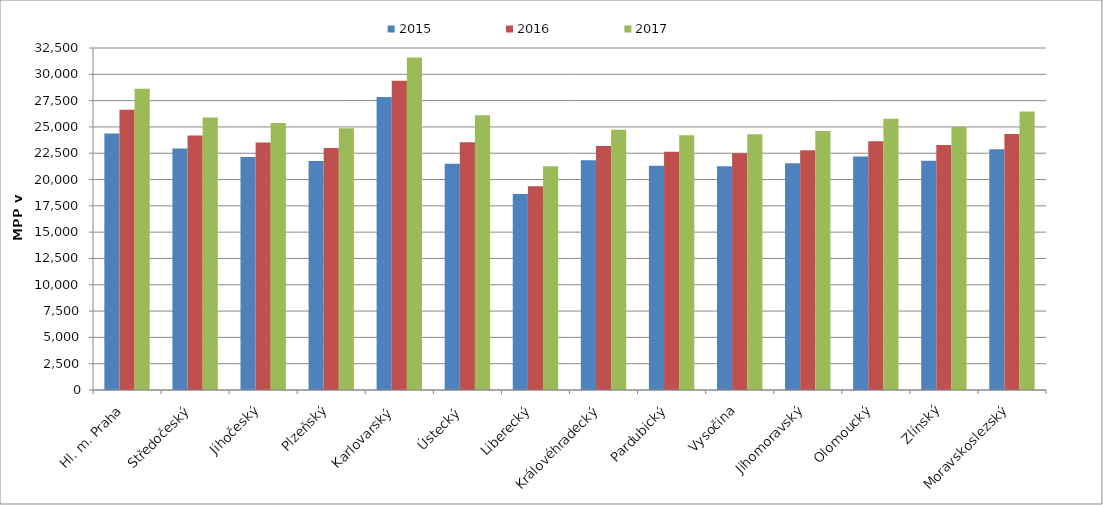
| Category | 2015 | 2016 | 2017 |
|---|---|---|---|
| Hl. m. Praha | 24379.612 | 26627.02 | 28620.357 |
| Středočeský | 22949.18 | 24182.525 | 25887.927 |
| Jihočeský | 22133.859 | 23524.011 | 25377.881 |
| Plzeňský | 21771.664 | 22993.122 | 24884.08 |
| Karlovarský  | 27853.211 | 29394.495 | 31596.33 |
| Ústecký   | 21508.677 | 23532.218 | 26102.283 |
| Liberecký | 18631.615 | 19367.222 | 21274.302 |
| Královéhradecký | 21822.834 | 23196.414 | 24742.779 |
| Pardubický | 21320.464 | 22649.131 | 24210.108 |
| Vysočina | 21254.658 | 22505.792 | 24306.483 |
| Jihomoravský | 21553.973 | 22789.315 | 24609.972 |
| Olomoucký | 22193.141 | 23632.818 | 25766.191 |
| Zlínský | 21790.591 | 23280.042 | 24991.095 |
| Moravskoslezský | 22883.685 | 24337.154 | 26456.807 |